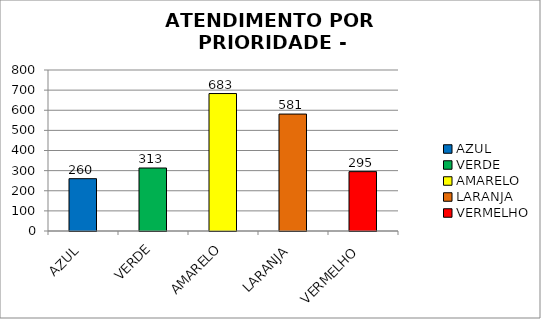
| Category | Total Regional: |
|---|---|
| AZUL | 260 |
| VERDE | 313 |
| AMARELO | 683 |
| LARANJA | 581 |
| VERMELHO | 295 |